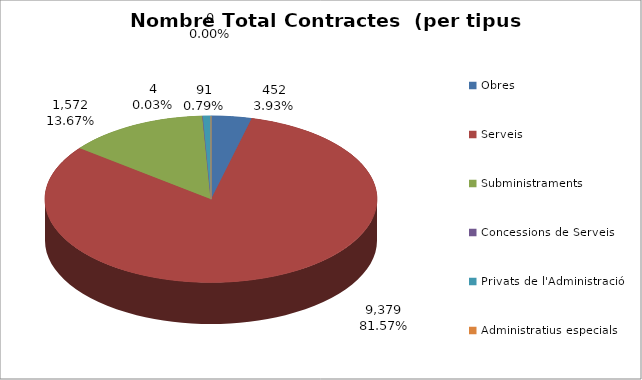
| Category | Nombre Total Contractes |
|---|---|
| Obres | 452 |
| Serveis | 9379 |
| Subministraments | 1572 |
| Concessions de Serveis | 4 |
| Privats de l'Administració | 91 |
| Administratius especials | 0 |